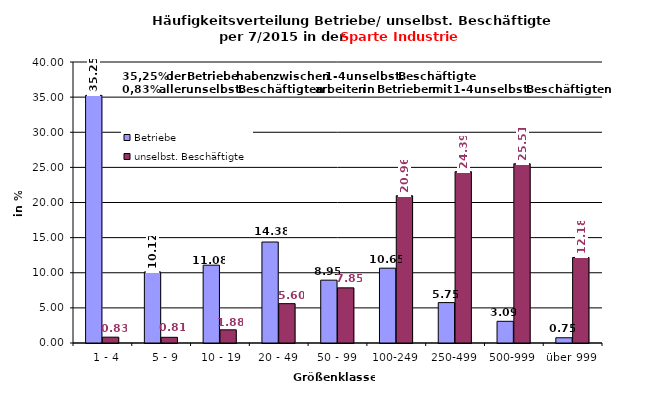
| Category | Betriebe | unselbst. Beschäftigte |
|---|---|---|
|   1 - 4 | 35.25 | 0.83 |
|   5 - 9 | 10.117 | 0.81 |
|  10 - 19 | 11.076 | 1.876 |
| 20 - 49 | 14.377 | 5.602 |
| 50 - 99 | 8.946 | 7.847 |
| 100-249 | 10.65 | 20.961 |
| 250-499 | 5.751 | 24.385 |
| 500-999 | 3.088 | 25.513 |
| über 999 | 0.745 | 12.175 |